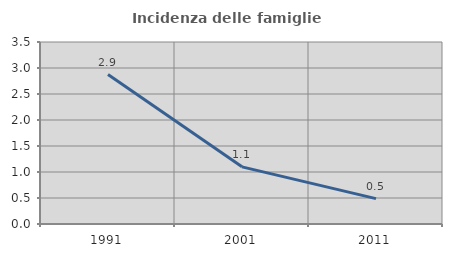
| Category | Incidenza delle famiglie numerose |
|---|---|
| 1991.0 | 2.874 |
| 2001.0 | 1.099 |
| 2011.0 | 0.488 |